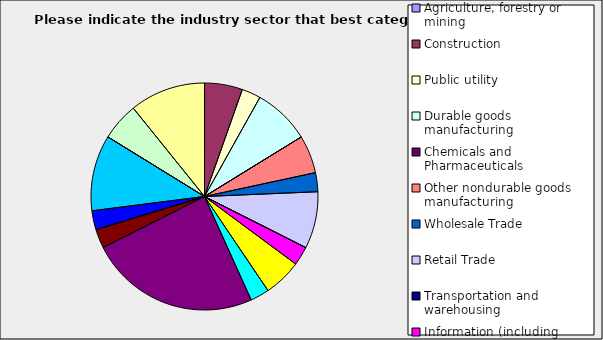
| Category | Series 0 |
|---|---|
| Agriculture, forestry or mining | 0 |
| Construction | 0.054 |
| Public utility | 0.027 |
| Durable goods manufacturing | 0.081 |
| Chemicals and Pharmaceuticals | 0 |
| Other nondurable goods manufacturing | 0.054 |
| Wholesale Trade | 0.027 |
| Retail Trade | 0.081 |
| Transportation and warehousing | 0 |
| Information (including broadcasting and telecommunication) | 0.027 |
| Finance and Insurance | 0.054 |
| Real Estate | 0.027 |
| Professional, scientific and technical services | 0.243 |
| Consulting | 0.027 |
| Administrative and office services (including waste management) | 0 |
| Education | 0.027 |
| Health Care and social services | 0.108 |
| Arts, entertainment and recreation | 0 |
| Accommodation and food services | 0.054 |
| Other | 0.108 |